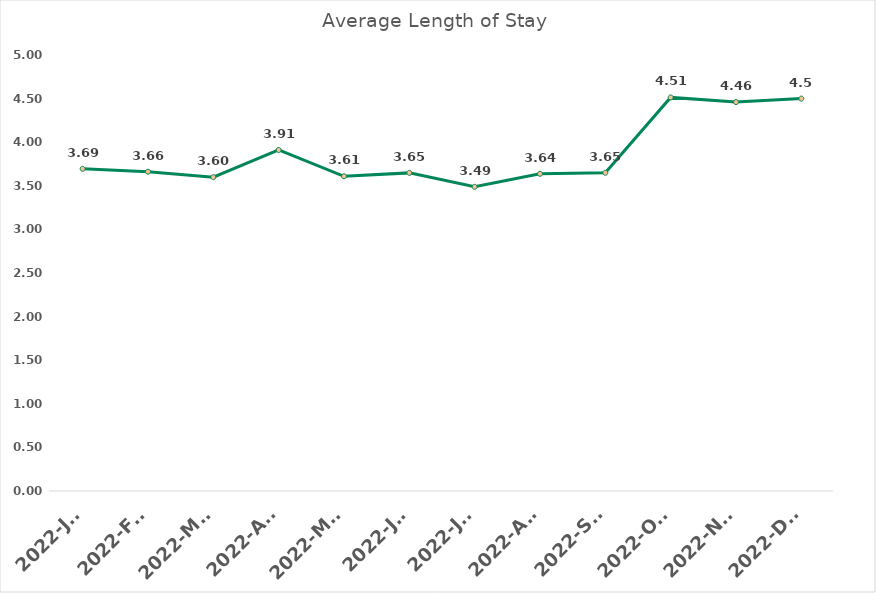
| Category | Average Length of Stay  |
|---|---|
| 2022-Jan | 3.695 |
| 2022-Feb | 3.661 |
| 2022-Mar | 3.599 |
| 2022-Apr | 3.911 |
| 2022-May | 3.609 |
| 2022-Jun | 3.648 |
| 2022-Jul | 3.488 |
| 2022-Aug | 3.637 |
| 2022-Sep | 3.65 |
| 2022-Oct | 4.514 |
| 2022-Nov | 4.46 |
| 2022-Dec | 4.5 |